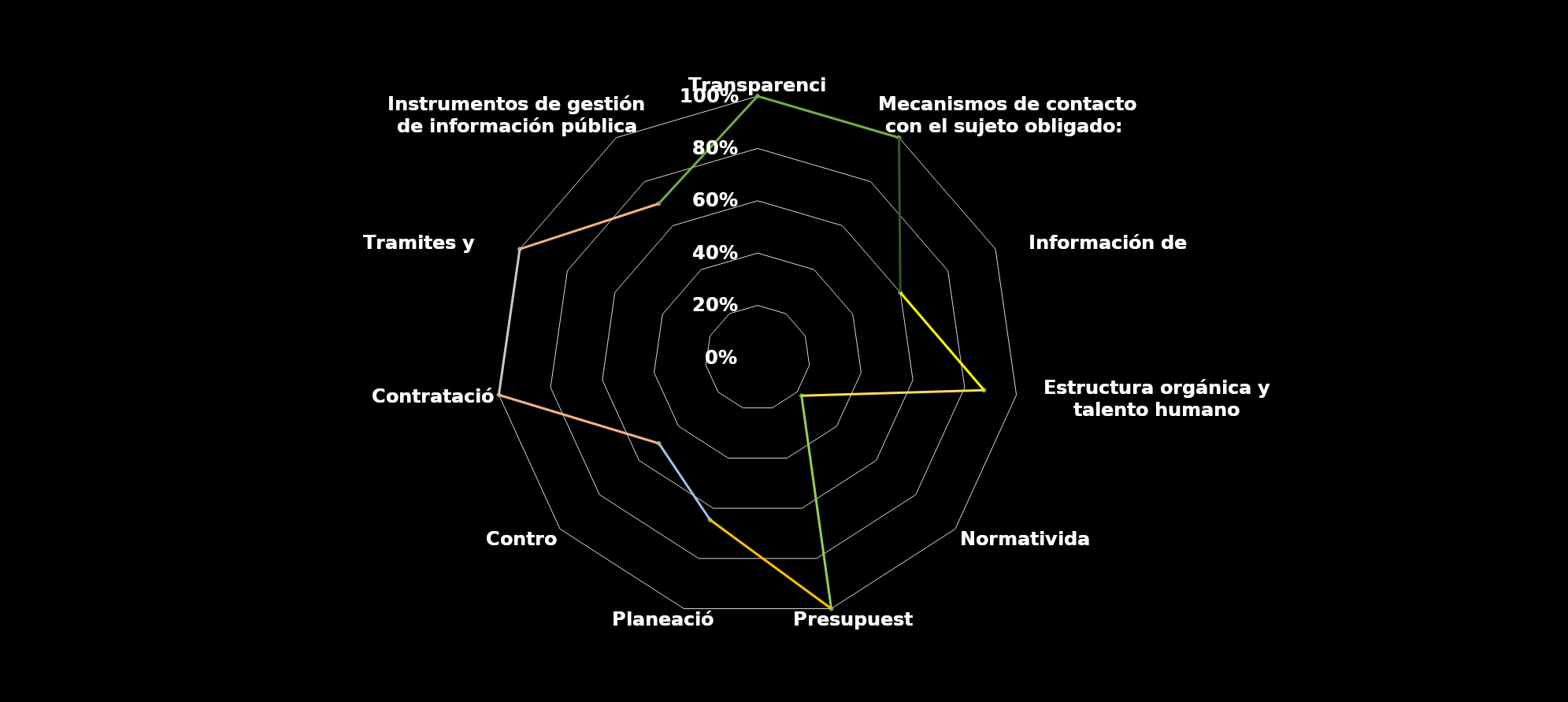
| Category | Total |
|---|---|
| Transparencia | 1 |
| Mecanismos de contacto con el sujeto obligado:  | 1 |
| Información de interés  | 0.6 |
| Estructura orgánica y talento humano | 0.875 |
| Normatividad  | 0.222 |
| Presupuesto | 1 |
| Planeación | 0.646 |
| Control | 0.5 |
| Contratación | 1 |
| Tramites y Servicios | 1 |
| Instrumentos de gestión de información pública | 0.7 |